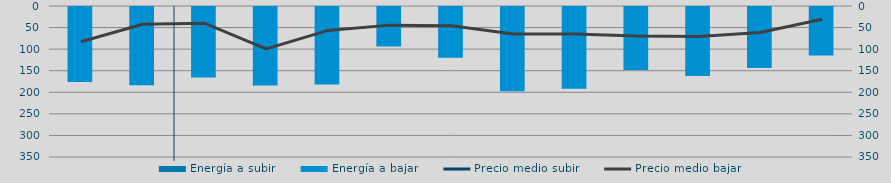
| Category | Energía a subir | Energía a bajar |
|---|---|---|
| N |  | 176.116 |
| D |  | 183.605 |
| E |  | 165.84 |
| F |  | 184.155 |
| M |  | 182.05 |
| A |  | 93.896 |
| M |  | 120.063 |
| J |  | 197.687 |
| J |  | 191.747 |
| A |  | 148.51 |
| S |  | 162.496 |
| O |  | 143.824 |
| N |  | 114.874 |